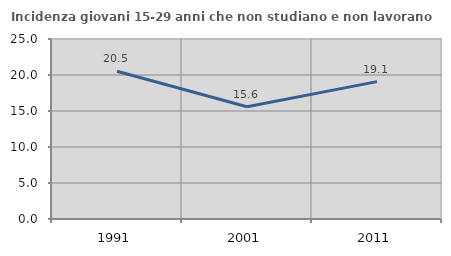
| Category | Incidenza giovani 15-29 anni che non studiano e non lavorano  |
|---|---|
| 1991.0 | 20.519 |
| 2001.0 | 15.584 |
| 2011.0 | 19.082 |